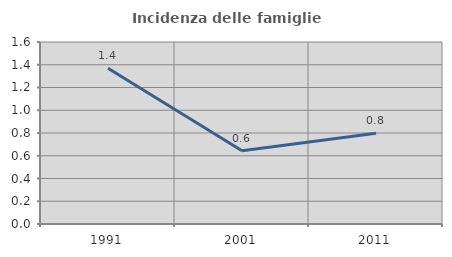
| Category | Incidenza delle famiglie numerose |
|---|---|
| 1991.0 | 1.37 |
| 2001.0 | 0.644 |
| 2011.0 | 0.797 |